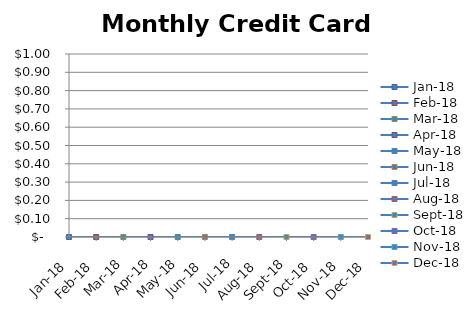
| Category | Monthly Credit Card Charges |
|---|---|
| 2018-01-01 | 0 |
| 2018-02-01 | 0 |
| 2018-03-01 | 0 |
| 2018-04-01 | 0 |
| 2018-05-01 | 0 |
| 2018-06-01 | 0 |
| 2018-07-01 | 0 |
| 2018-08-01 | 0 |
| 2018-09-01 | 0 |
| 2018-10-01 | 0 |
| 2018-11-01 | 0 |
| 2018-12-01 | 0 |